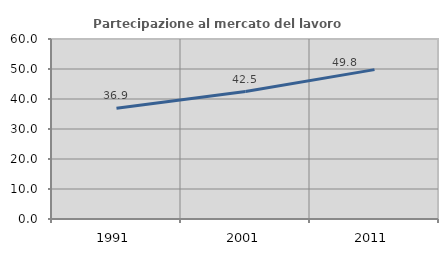
| Category | Partecipazione al mercato del lavoro  femminile |
|---|---|
| 1991.0 | 36.919 |
| 2001.0 | 42.498 |
| 2011.0 | 49.791 |